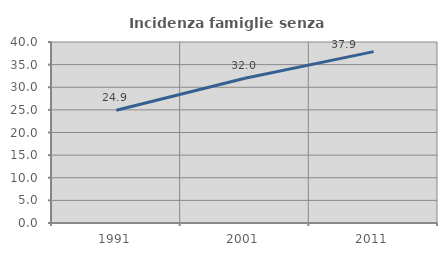
| Category | Incidenza famiglie senza nuclei |
|---|---|
| 1991.0 | 24.922 |
| 2001.0 | 31.975 |
| 2011.0 | 37.87 |